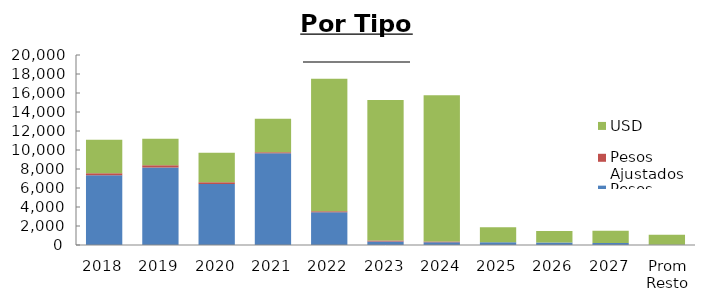
| Category | Pesos | Pesos Ajustados | USD |
|---|---|---|---|
| 2018 | 7335.164 | 212.251 | 3544.31 |
| 2019 | 8165.246 | 242.592 | 2771.312 |
| 2020 | 6417.764 | 180.018 | 3120.969 |
| 2021 | 9662.095 | 105.034 | 3530.931 |
| 2022 | 3457.627 | 95.135 | 13960.303 |
| 2023 | 376.32 | 89.554 | 14786.664 |
| 2024 | 295.669 | 74.617 | 15385.224 |
| 2025 | 277.094 | 24.191 | 1560.519 |
| 2026 | 251.696 | 3.366 | 1209.28 |
| 2027 | 216.957 | 0 | 1288.496 |
| Prom Resto | 39.222 | 0 | 1046.19 |